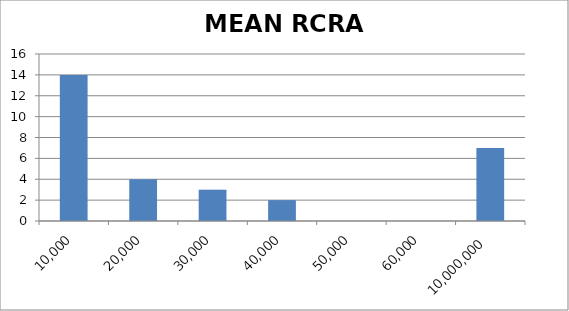
| Category | Series 0 |
|---|---|
| 10000.0 | 14 |
| 20000.0 | 4 |
| 30000.0 | 3 |
| 40000.0 | 2 |
| 50000.0 | 0 |
| 60000.0 | 0 |
| 10000000.0 | 7 |